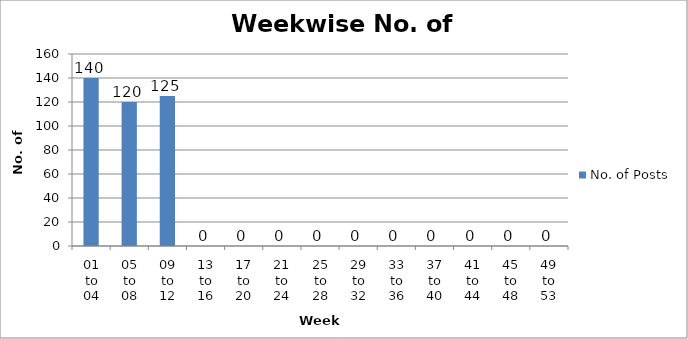
| Category | No. of Posts |
|---|---|
| 01 to 04 | 140 |
| 05 to 08 | 120 |
| 09 to 12 | 125 |
| 13 to 16 | 0 |
| 17 to 20 | 0 |
| 21 to 24 | 0 |
| 25 to 28 | 0 |
| 29 to 32 | 0 |
| 33 to 36 | 0 |
| 37 to 40 | 0 |
| 41 to 44 | 0 |
| 45 to 48 | 0 |
| 49 to 53 | 0 |